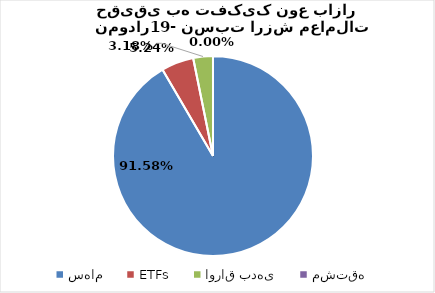
| Category | نسبت ارزش معاملات حقیقی |
|---|---|
| سهام | 0.916 |
| ETFs | 0.052 |
| اوراق بدهی | 0.032 |
| مشتقه | 0 |